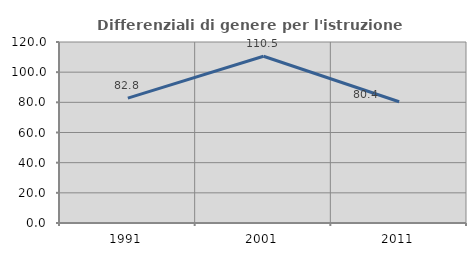
| Category | Differenziali di genere per l'istruzione superiore |
|---|---|
| 1991.0 | 82.791 |
| 2001.0 | 110.526 |
| 2011.0 | 80.392 |